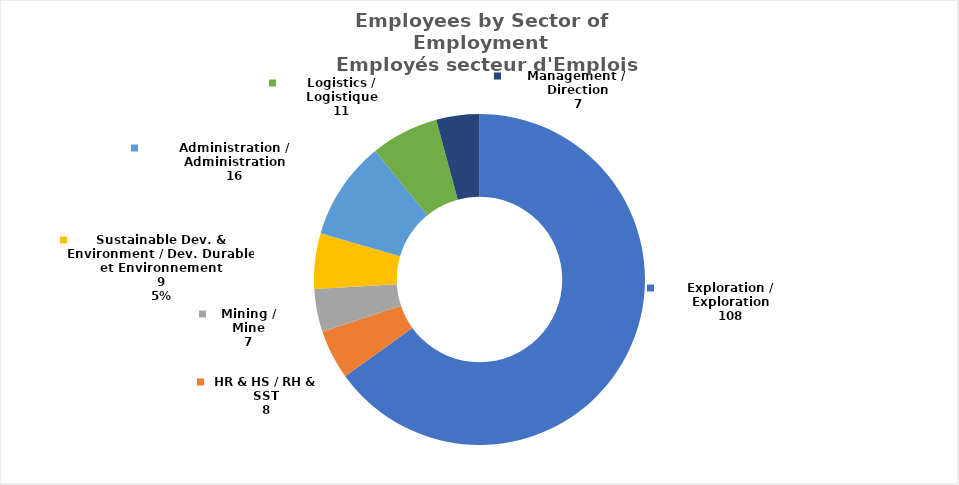
| Category | Series 0 |
|---|---|
| Exploration / Exploration | 108 |
| HR & HS / RH & SST | 8 |
| Mining / Mine | 7 |
| Sustainable Dev. & Environment / Dev. Durable et Environnement | 9 |
| Administration / Administration | 16 |
| Logistics / Logistique | 11 |
| Management /  Direction | 7 |